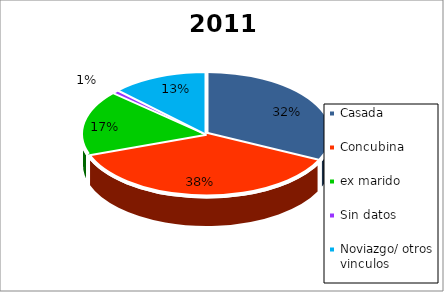
| Category | 2011 |
|---|---|
| Casada | 36 |
| Concubina | 42 |
| ex marido | 19 |
| Sin datos | 1 |
| Noviazgo/ otros vinculos | 14 |